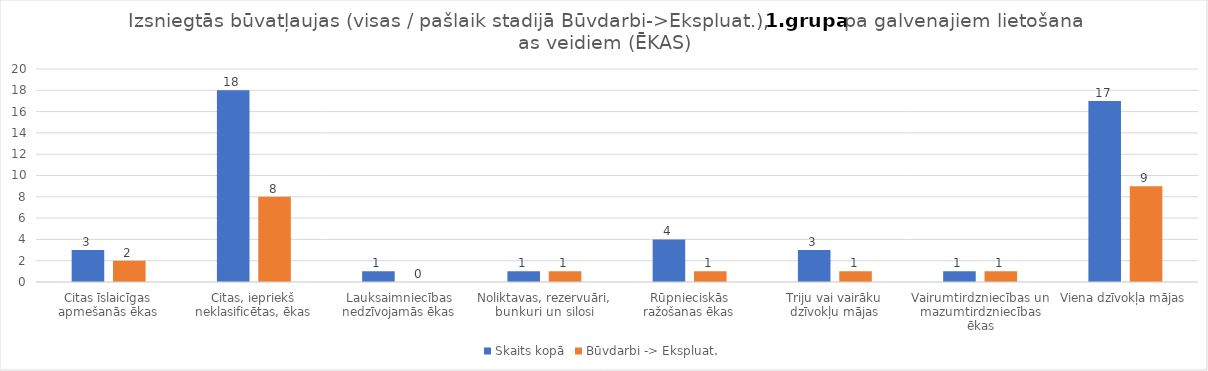
| Category | Skaits kopā | Būvdarbi -> Ekspluat. |
|---|---|---|
| Citas īslaicīgas apmešanās ēkas | 3 | 2 |
| Citas, iepriekš neklasificētas, ēkas | 18 | 8 |
| Lauksaimniecības nedzīvojamās ēkas | 1 | 0 |
| Noliktavas, rezervuāri, bunkuri un silosi | 1 | 1 |
| Rūpnieciskās ražošanas ēkas | 4 | 1 |
| Triju vai vairāku dzīvokļu mājas | 3 | 1 |
| Vairumtirdzniecības un mazumtirdzniecības ēkas | 1 | 1 |
| Viena dzīvokļa mājas | 17 | 9 |